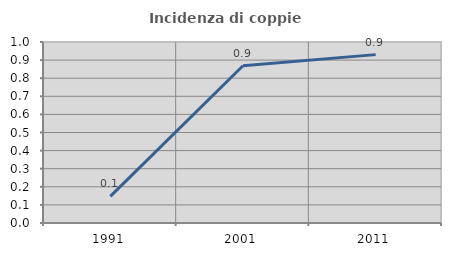
| Category | Incidenza di coppie miste |
|---|---|
| 1991.0 | 0.147 |
| 2001.0 | 0.868 |
| 2011.0 | 0.93 |